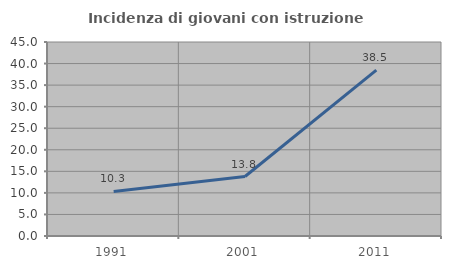
| Category | Incidenza di giovani con istruzione universitaria |
|---|---|
| 1991.0 | 10.345 |
| 2001.0 | 13.793 |
| 2011.0 | 38.462 |